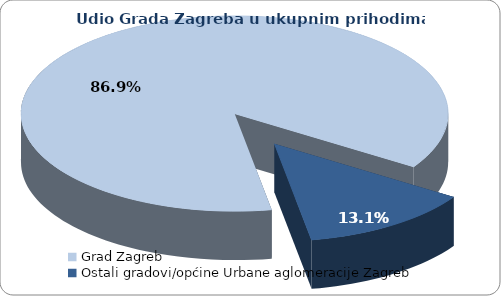
| Category | Series 2 |
|---|---|
| Grad Zagreb | 368993687.821 |
| Ostali gradovi/općine Urbane aglomeracije Zagreb | 55388552.873 |